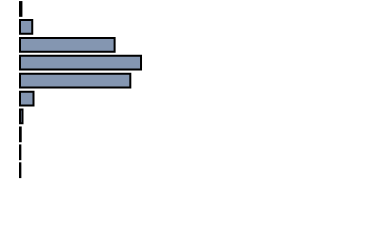
| Category | Series 0 |
|---|---|
| 0 | 0.4 |
| 1 | 3.4 |
| 2 | 26.5 |
| 3 | 33.9 |
| 4 | 30.9 |
| 5 | 3.8 |
| 6 | 0.7 |
| 7 | 0.2 |
| 8 | 0.1 |
| 9 | 0.1 |
| 10 | 0 |
| 11 | 0 |